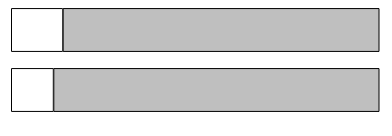
| Category | Series 0 | Series 1 |
|---|---|---|
| 0 | 148802 | 1145647 |
| 1 | 214063 | 1310991 |